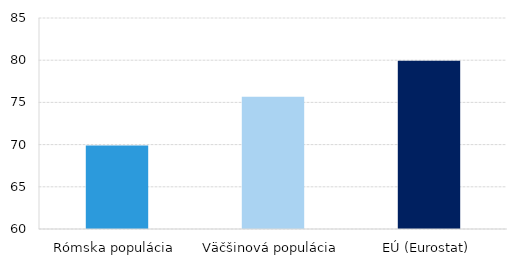
| Category | Series 0 |
|---|---|
| Rómska populácia | 69.9 |
| Väčšinová populácia | 75.659 |
| EÚ (Eurostat) | 79.94 |